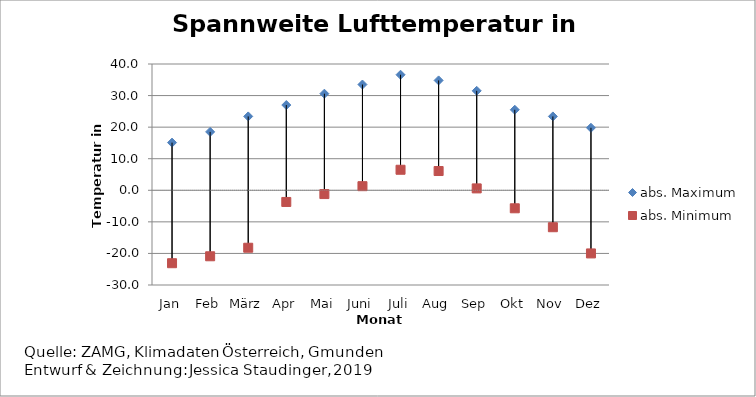
| Category | abs. Maximum | abs. Minimum |
|---|---|---|
| Jan | 15.1 | -23.1 |
| Feb | 18.5 | -20.9 |
| März | 23.4 | -18.2 |
| Apr | 27 | -3.7 |
| Mai | 30.6 | -1.2 |
| Juni | 33.5 | 1.3 |
| Juli | 36.6 | 6.5 |
| Aug | 34.8 | 6.1 |
| Sep | 31.5 | 0.6 |
| Okt | 25.5 | -5.7 |
| Nov | 23.4 | -11.7 |
| Dez | 19.8 | -20 |